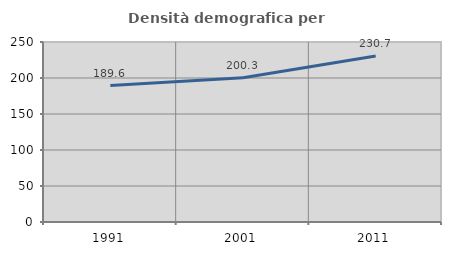
| Category | Densità demografica |
|---|---|
| 1991.0 | 189.575 |
| 2001.0 | 200.348 |
| 2011.0 | 230.668 |